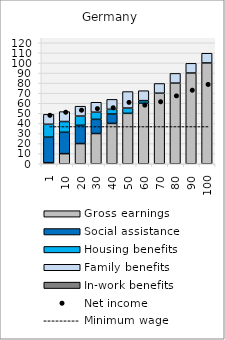
| Category | Gross earnings | Social assistance | Housing benefits | Family benefits | In-work benefits |
|---|---|---|---|---|---|
| 1.0 | 1 | 25.363 | 12.797 | 9.855 | 0 |
| 10.0 | 10 | 21.192 | 10.692 | 9.855 | 0 |
| 20.0 | 20 | 18.122 | 9.143 | 9.855 | 0 |
| 30.0 | 30 | 14.053 | 7.09 | 9.855 | 0 |
| 40.0 | 40 | 9.314 | 4.699 | 9.855 | 0 |
| 50.0 | 50 | 0 | 5.231 | 16.393 | 0 |
| 60.0 | 60 | 0 | 2.615 | 9.855 | 0 |
| 70.0 | 70 | 0 | 0 | 9.641 | 0 |
| 80.0 | 80 | 0 | 0 | 9.641 | 0 |
| 90.0 | 90 | 0 | 0 | 9.641 | 0 |
| 100.0 | 100 | 0 | 0 | 9.641 | 0 |